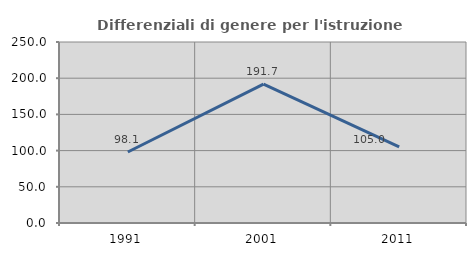
| Category | Differenziali di genere per l'istruzione superiore |
|---|---|
| 1991.0 | 98.077 |
| 2001.0 | 191.713 |
| 2011.0 | 105 |